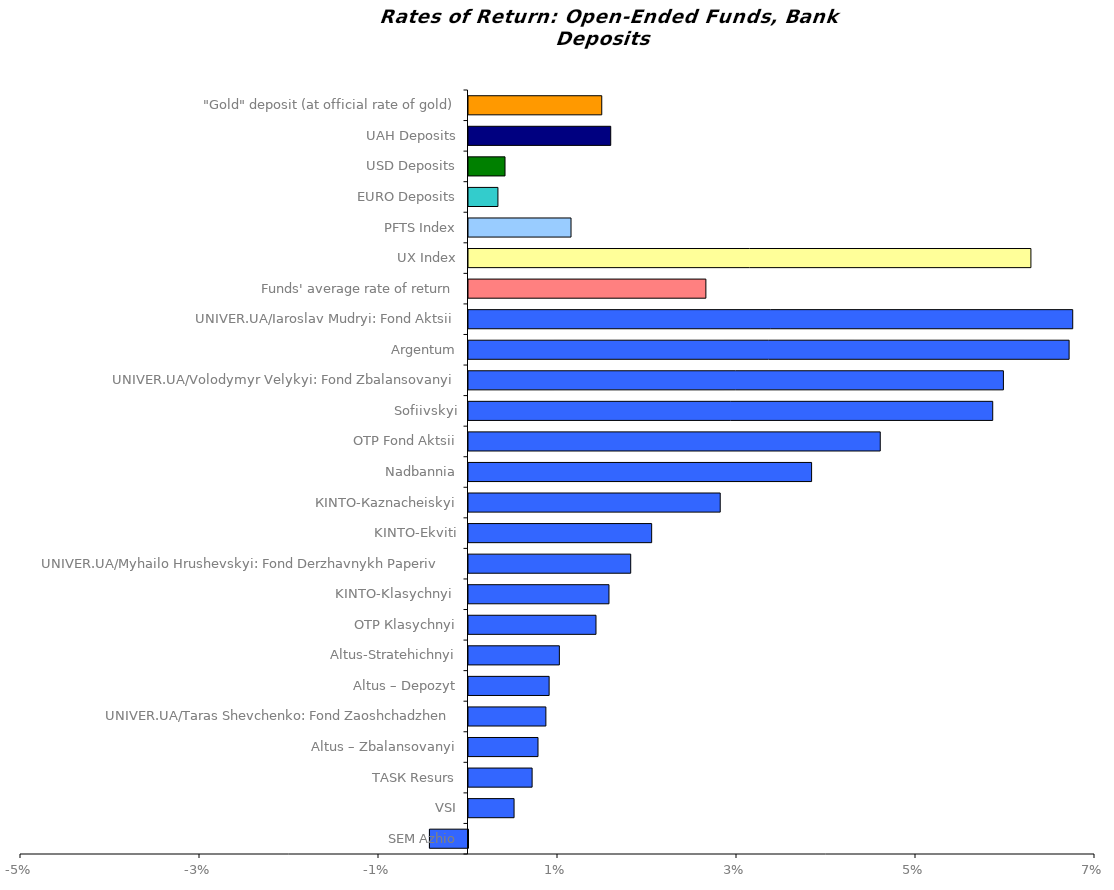
| Category | Series 0 |
|---|---|
| SEM Azhio | -0.004 |
| VSI | 0.005 |
| ТАSК Resurs | 0.007 |
| Altus – Zbalansovanyi | 0.008 |
| UNIVER.UA/Taras Shevchenko: Fond Zaoshchadzhen | 0.009 |
| Altus – Depozyt | 0.009 |
| Altus-Stratehichnyi | 0.01 |
| ОТP Кlasychnyi | 0.014 |
| KINTO-Klasychnyi  | 0.016 |
| UNIVER.UA/Myhailo Hrushevskyi: Fond Derzhavnykh Paperiv    | 0.018 |
| KINTO-Ekviti | 0.02 |
| КІNTO-Каznacheiskyi | 0.028 |
| Nadbannia | 0.038 |
| ОТP Fond Aktsii | 0.046 |
| Sofiivskyi | 0.059 |
| UNIVER.UA/Volodymyr Velykyi: Fond Zbalansovanyi | 0.06 |
| Аrgentum | 0.067 |
| UNIVER.UA/Iaroslav Mudryi: Fond Aktsii | 0.068 |
| Funds' average rate of return | 0.027 |
| UX Index | 0.063 |
| PFTS Index | 0.011 |
| EURO Deposits | 0.003 |
| USD Deposits | 0.004 |
| UAH Deposits | 0.016 |
| "Gold" deposit (at official rate of gold) | 0.015 |